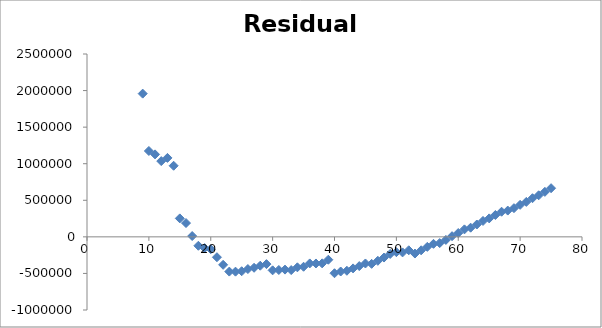
| Category | Series 0 |
|---|---|
| 9.0 | 1958068.609 |
| 10.0 | 1174065.617 |
| 11.0 | 1127586.624 |
| 12.0 | 1035644.632 |
| 13.0 | 1079545.64 |
| 14.0 | 972154.648 |
| 15.0 | 252365.656 |
| 16.0 | 188699.663 |
| 17.0 | 11162.671 |
| 18.0 | -121930.321 |
| 19.0 | -153610.313 |
| 20.0 | -168985.306 |
| 21.0 | -278207.298 |
| 22.0 | -382372.29 |
| 23.0 | -474833.282 |
| 24.0 | -475889.274 |
| 25.0 | -469925.267 |
| 26.0 | -440197.259 |
| 27.0 | -422645.251 |
| 28.0 | -394505.243 |
| 29.0 | -372634.235 |
| 30.0 | -457666.228 |
| 31.0 | -452945.22 |
| 32.0 | -447754.212 |
| 33.0 | -454146.204 |
| 34.0 | -416537.197 |
| 35.0 | -408775.189 |
| 36.0 | -363196.181 |
| 37.0 | -363918.173 |
| 38.0 | -362527.165 |
| 39.0 | -312683.158 |
| 40.0 | -497494.15 |
| 41.0 | -473721.142 |
| 42.0 | -463488.134 |
| 43.0 | -431289.127 |
| 44.0 | -399504.119 |
| 45.0 | -363865.111 |
| 46.0 | -369079.103 |
| 47.0 | -327530.095 |
| 48.0 | -282962.088 |
| 49.0 | -233609.08 |
| 50.0 | -209267.072 |
| 51.0 | -212673.064 |
| 52.0 | -183476.057 |
| 53.0 | -228146.049 |
| 54.0 | -183803.041 |
| 55.0 | -136653.033 |
| 56.0 | -95388.025 |
| 57.0 | -85230.018 |
| 58.0 | -41779.01 |
| 59.0 | 9301.998 |
| 60.0 | 52583.006 |
| 61.0 | 102471.014 |
| 62.0 | 125406.021 |
| 63.0 | 168923.029 |
| 64.0 | 217474.037 |
| 65.0 | 252355.045 |
| 66.0 | 299014.052 |
| 67.0 | 343578.06 |
| 68.0 | 359479.068 |
| 69.0 | 392109.076 |
| 70.0 | 437862.084 |
| 71.0 | 477973.091 |
| 72.0 | 528383.099 |
| 73.0 | 568336.107 |
| 74.0 | 615081.115 |
| 75.0 | 665218.122 |